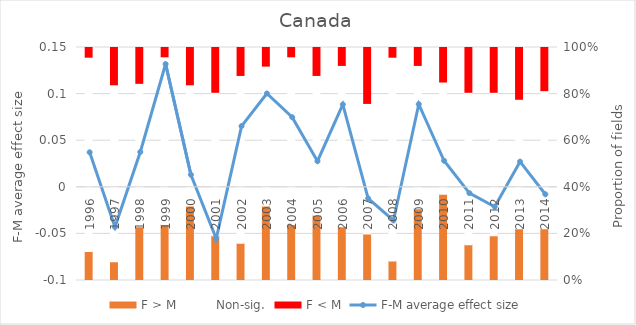
| Category | F > M | Non-sig. | F < M |
|---|---|---|---|
| 0 | 3 | 20 | 1 |
| 1 | 2 | 19 | 4 |
| 2 | 6 | 16 | 4 |
| 3 | 6 | 18 | 1 |
| 4 | 8 | 13 | 4 |
| 5 | 5 | 16 | 5 |
| 6 | 4 | 18 | 3 |
| 7 | 8 | 15 | 2 |
| 8 | 6 | 18 | 1 |
| 9 | 7 | 15 | 3 |
| 10 | 6 | 18 | 2 |
| 11 | 5 | 14 | 6 |
| 12 | 2 | 21 | 1 |
| 13 | 8 | 16 | 2 |
| 14 | 10 | 13 | 4 |
| 15 | 4 | 17 | 5 |
| 16 | 5 | 16 | 5 |
| 17 | 6 | 15 | 6 |
| 18 | 6 | 16 | 5 |